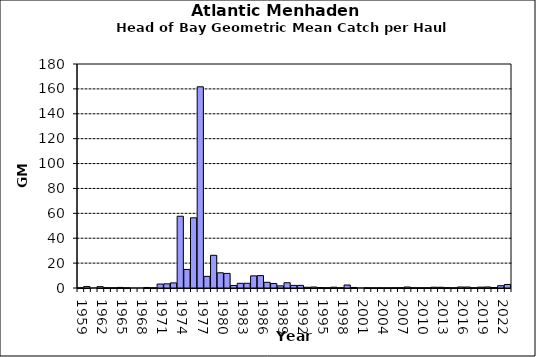
| Category | Series 0 |
|---|---|
| 1959.0 | 0.072 |
| 1960.0 | 1.169 |
| 1961.0 | 0 |
| 1962.0 | 1.08 |
| 1963.0 | 0.201 |
| 1964.0 | 0.113 |
| 1965.0 | 0.476 |
| 1966.0 | 0.089 |
| 1967.0 | 0 |
| 1968.0 | 0 |
| 1969.0 | 0.41 |
| 1970.0 | 0.034 |
| 1971.0 | 3.18 |
| 1972.0 | 3.354 |
| 1973.0 | 4.104 |
| 1974.0 | 57.678 |
| 1975.0 | 14.918 |
| 1976.0 | 56.413 |
| 1977.0 | 161.67 |
| 1978.0 | 9.348 |
| 1979.0 | 26.274 |
| 1980.0 | 12.22 |
| 1981.0 | 11.728 |
| 1982.0 | 2.042 |
| 1983.0 | 3.76 |
| 1984.0 | 3.799 |
| 1985.0 | 9.746 |
| 1986.0 | 9.959 |
| 1987.0 | 4.576 |
| 1988.0 | 3.59 |
| 1989.0 | 1.729 |
| 1990.0 | 4.228 |
| 1991.0 | 2.102 |
| 1992.0 | 2.115 |
| 1993.0 | 0.59 |
| 1994.0 | 0.784 |
| 1995.0 | 0.326 |
| 1996.0 | 0.153 |
| 1997.0 | 0.646 |
| 1998.0 | 0.065 |
| 1999.0 | 2.404 |
| 2000.0 | 0.437 |
| 2001.0 | 0 |
| 2002.0 | 0.111 |
| 2003.0 | 0.034 |
| 2004.0 | 0.06 |
| 2005.0 | 0.034 |
| 2006.0 | 0.166 |
| 2007.0 | 0.161 |
| 2008.0 | 0.802 |
| 2009.0 | 0.15 |
| 2010.0 | 0.107 |
| 2011.0 | 0.143 |
| 2012.0 | 0.632 |
| 2013.0 | 0.582 |
| 2014.0 | 0.237 |
| 2015.0 | 0.071 |
| 2016.0 | 0.82 |
| 2017.0 | 0.794 |
| 2018.0 | 0.141 |
| 2019.0 | 0.694 |
| 2020.0 | 0.85 |
| 2021.0 | 0.38 |
| 2022.0 | 1.858 |
| 2023.0 | 2.834 |